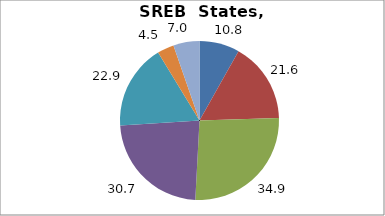
| Category | Series 0 |
|---|---|
| Higher Education | 10.817 |
| Elementary and Secondary Education | 21.596 |
| Total Education1 | 34.904 |
| Social Welfare2 | 30.655 |
| Transportation, Public Safety, Environment and Housing3 | 22.9 |
| Administration | 4.505 |
| Other4 | 7.035 |